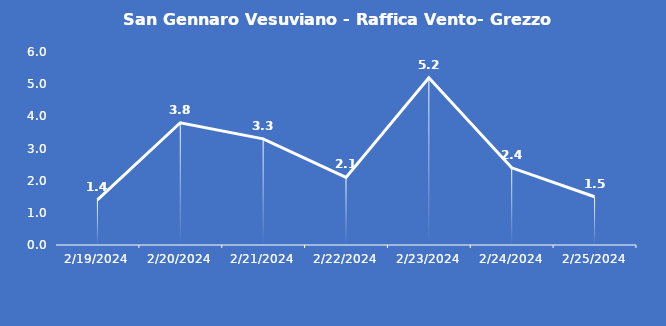
| Category | San Gennaro Vesuviano - Raffica Vento- Grezzo (m/s) |
|---|---|
| 2/19/24 | 1.4 |
| 2/20/24 | 3.8 |
| 2/21/24 | 3.3 |
| 2/22/24 | 2.1 |
| 2/23/24 | 5.2 |
| 2/24/24 | 2.4 |
| 2/25/24 | 1.5 |